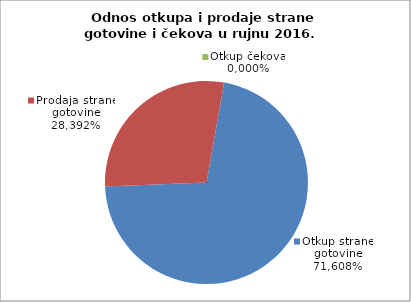
| Category | Otkup strane gotovine |
|---|---|
| 0 | 0.716 |
| 1 | 0.284 |
| 2 | 0 |